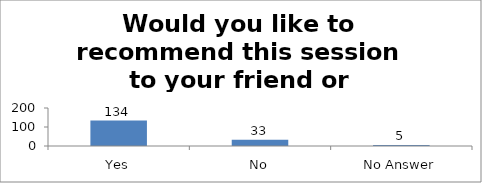
| Category | Would you like to recommend this session to your friend or colleague? |
|---|---|
| Yes | 134 |
| No | 33 |
| No Answer | 5 |